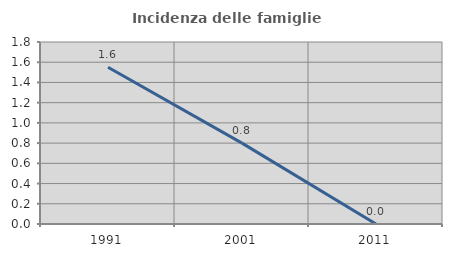
| Category | Incidenza delle famiglie numerose |
|---|---|
| 1991.0 | 1.55 |
| 2001.0 | 0.8 |
| 2011.0 | 0 |